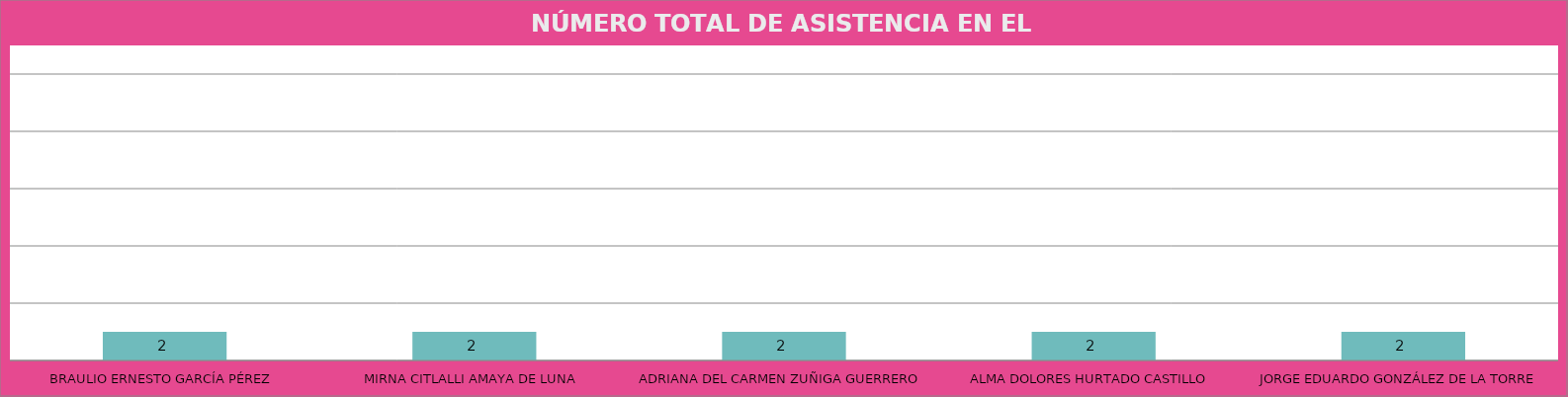
| Category | BRAULIO ERNESTO GARCÍA PÉREZ |
|---|---|
| BRAULIO ERNESTO GARCÍA PÉREZ | 2 |
| MIRNA CITLALLI AMAYA DE LUNA | 2 |
| ADRIANA DEL CARMEN ZUÑIGA GUERRERO | 2 |
| ALMA DOLORES HURTADO CASTILLO | 2 |
| JORGE EDUARDO GONZÁLEZ DE LA TORRE | 2 |